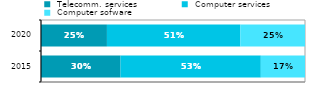
| Category |  Telecomm. services |  Computer services |  Computer sofware |
|---|---|---|---|
|  2015 | 0.301 | 0.531 | 0.167 |
|  2020 | 0.25 | 0.505 | 0.245 |